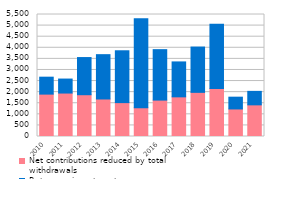
| Category | Net contributions reduced by total withdrawals | Return on investment |
|---|---|---|
| 2010.0 | 1910.832 | 763.643 |
| 2011.0 | 1958.804 | 630.702 |
| 2012.0 | 1883.66 | 1675.325 |
| 2013.0 | 1691.5 | 1997.9 |
| 2014.0 | 1527.605 | 2337.023 |
| 2015.0 | 1301.69 | 4007.745 |
| 2016.0 | 1641.03 | 2274.273 |
| 2017.0 | 1787.87 | 1574.448 |
| 2018.0 | 1990.31 | 2042.247 |
| 2019.0 | 2163.69 | 2896.81 |
| 2020.0 | 1242.26 | 530.447 |
| 2021.0 | 1426.6 | 607.9 |